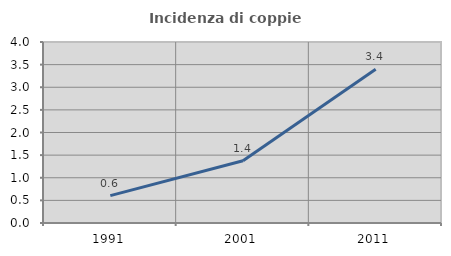
| Category | Incidenza di coppie miste |
|---|---|
| 1991.0 | 0.606 |
| 2001.0 | 1.376 |
| 2011.0 | 3.397 |